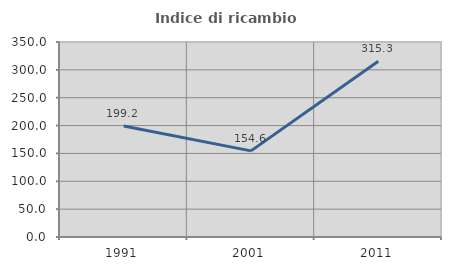
| Category | Indice di ricambio occupazionale  |
|---|---|
| 1991.0 | 199.18 |
| 2001.0 | 154.615 |
| 2011.0 | 315.278 |